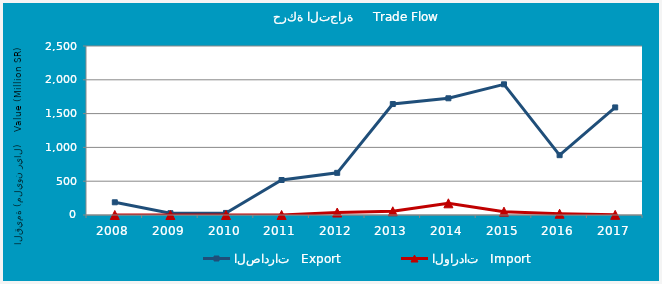
| Category | الصادرات   Export | الواردات   Import |
|---|---|---|
| 2008.0 | 188008137 | 204140 |
| 2009.0 | 26732763 | 95814 |
| 2010.0 | 30681022 | 353399 |
| 2011.0 | 517617757 | 405068 |
| 2012.0 | 623808435 | 36604258 |
| 2013.0 | 1641427891 | 55024951 |
| 2014.0 | 1726522430 | 172734146 |
| 2015.0 | 1933151100 | 49835238 |
| 2016.0 | 884971518 | 18751290 |
| 2017.0 | 1591424329 | 2244028 |